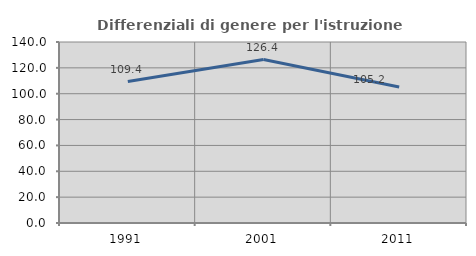
| Category | Differenziali di genere per l'istruzione superiore |
|---|---|
| 1991.0 | 109.428 |
| 2001.0 | 126.431 |
| 2011.0 | 105.207 |